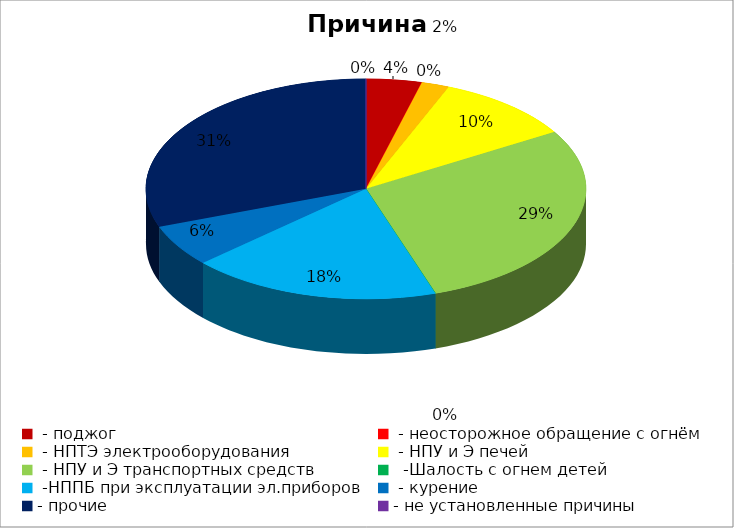
| Category | Причина пожара |
|---|---|
|  - поджог | 2 |
|  - неосторожное обращение с огнём | 0 |
|  - НПТЭ электрооборудования | 1 |
|  - НПУ и Э печей | 5 |
|  - НПУ и Э транспортных средств | 14 |
|   -Шалость с огнем детей | 0 |
|  -НППБ при эксплуатации эл.приборов | 9 |
|  - курение | 3 |
| - прочие | 15 |
| - не установленные причины | 0 |